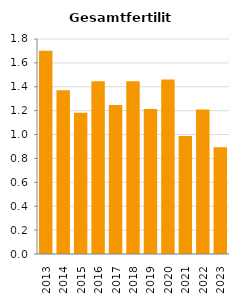
| Category | Gesamtfertilität |
|---|---|
| 2013.0 | 1.703 |
| 2014.0 | 1.372 |
| 2015.0 | 1.182 |
| 2016.0 | 1.446 |
| 2017.0 | 1.248 |
| 2018.0 | 1.446 |
| 2019.0 | 1.213 |
| 2020.0 | 1.46 |
| 2021.0 | 0.989 |
| 2022.0 | 1.21 |
| 2023.0 | 0.895 |